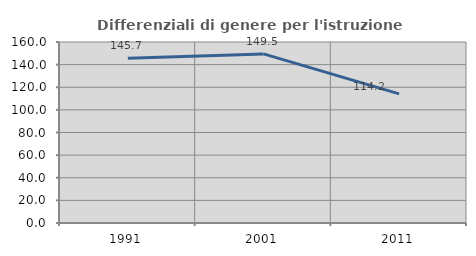
| Category | Differenziali di genere per l'istruzione superiore |
|---|---|
| 1991.0 | 145.714 |
| 2001.0 | 149.494 |
| 2011.0 | 114.179 |